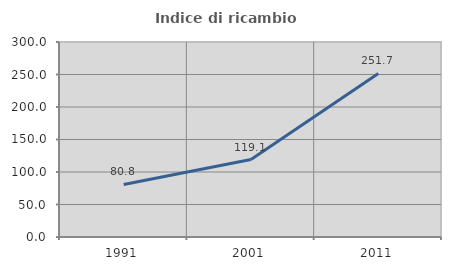
| Category | Indice di ricambio occupazionale  |
|---|---|
| 1991.0 | 80.812 |
| 2001.0 | 119.101 |
| 2011.0 | 251.675 |